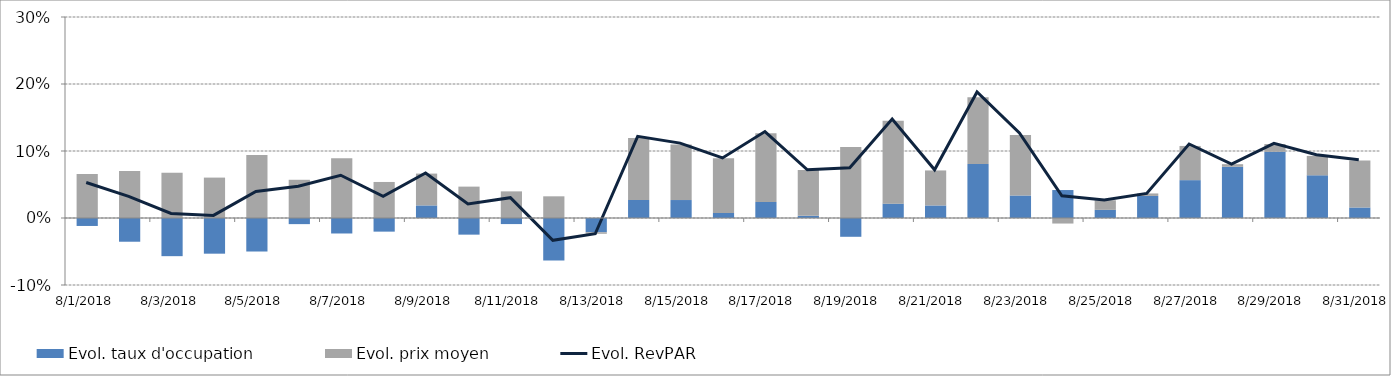
| Category | Evol. taux d'occupation | Evol. prix moyen |
|---|---|---|
| 8/1/18 | -0.012 | 0.066 |
| 8/2/18 | -0.035 | 0.07 |
| 8/3/18 | -0.057 | 0.068 |
| 8/4/18 | -0.053 | 0.06 |
| 8/5/18 | -0.05 | 0.094 |
| 8/6/18 | -0.009 | 0.057 |
| 8/7/18 | -0.023 | 0.089 |
| 8/8/18 | -0.02 | 0.054 |
| 8/9/18 | 0.019 | 0.047 |
| 8/10/18 | -0.025 | 0.047 |
| 8/11/18 | -0.009 | 0.04 |
| 8/12/18 | -0.064 | 0.032 |
| 8/13/18 | -0.021 | -0.002 |
| 8/14/18 | 0.027 | 0.092 |
| 8/15/18 | 0.027 | 0.083 |
| 8/16/18 | 0.008 | 0.082 |
| 8/17/18 | 0.024 | 0.103 |
| 8/18/18 | 0.003 | 0.068 |
| 8/19/18 | -0.028 | 0.106 |
| 8/20/18 | 0.021 | 0.124 |
| 8/21/18 | 0.019 | 0.052 |
| 8/22/18 | 0.081 | 0.099 |
| 8/23/18 | 0.034 | 0.09 |
| 8/24/18 | 0.042 | -0.008 |
| 8/25/18 | 0.012 | 0.014 |
| 8/26/18 | 0.033 | 0.004 |
| 8/27/18 | 0.057 | 0.051 |
| 8/28/18 | 0.076 | 0.004 |
| 8/29/18 | 0.099 | 0.012 |
| 8/30/18 | 0.064 | 0.029 |
| 8/31/18 | 0.016 | 0.07 |